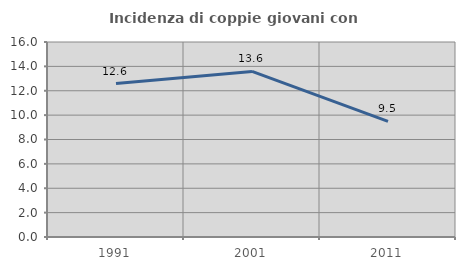
| Category | Incidenza di coppie giovani con figli |
|---|---|
| 1991.0 | 12.593 |
| 2001.0 | 13.584 |
| 2011.0 | 9.492 |